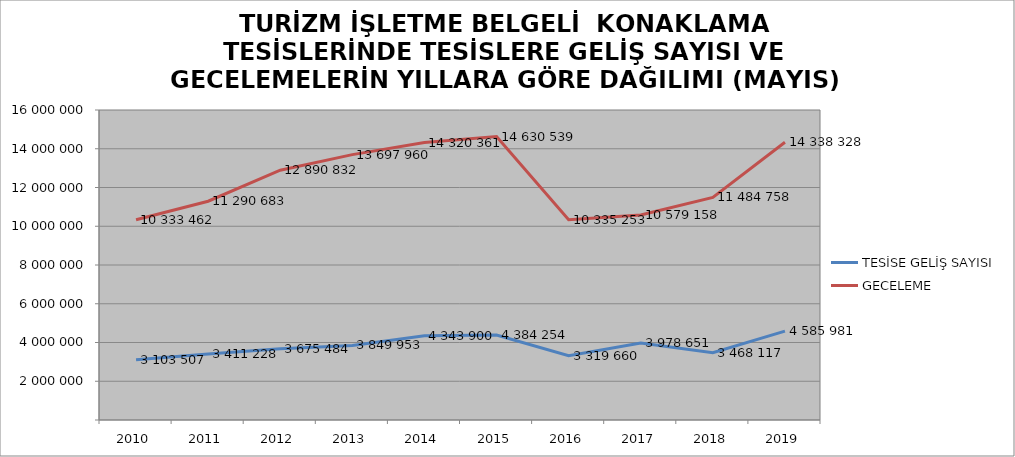
| Category | TESİSE GELİŞ SAYISI | GECELEME |
|---|---|---|
| 2010 | 3103507 | 10333462 |
| 2011 | 3411228 | 11290683 |
| 2012 | 3675484 | 12890832 |
| 2013 | 3849953 | 13697960 |
| 2014 | 4343900 | 14320361 |
| 2015 | 4384254 | 14630539 |
| 2016 | 3319660 | 10335253 |
| 2017 | 3978651 | 10579158 |
| 2018 | 3468117 | 11484758 |
| 2019 | 4585981 | 14338328 |